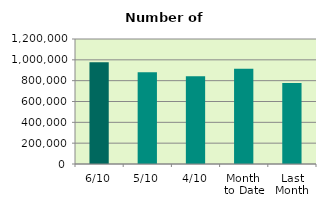
| Category | Series 0 |
|---|---|
| 6/10 | 975944 |
| 5/10 | 881272 |
| 4/10 | 842372 |
| Month 
to Date | 913627.5 |
| Last
Month | 778605.273 |